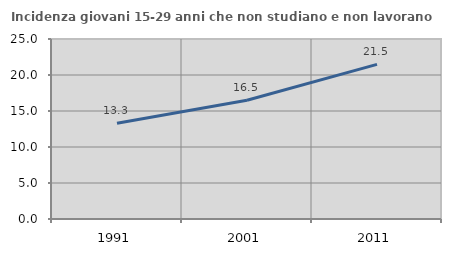
| Category | Incidenza giovani 15-29 anni che non studiano e non lavorano  |
|---|---|
| 1991.0 | 13.304 |
| 2001.0 | 16.495 |
| 2011.0 | 21.469 |